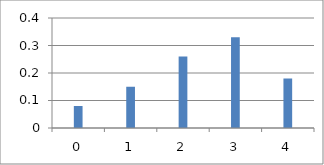
| Category | Series 0 |
|---|---|
| 0.0 | 0.08 |
| 1.0 | 0.15 |
| 2.0 | 0.26 |
| 3.0 | 0.33 |
| 4.0 | 0.18 |